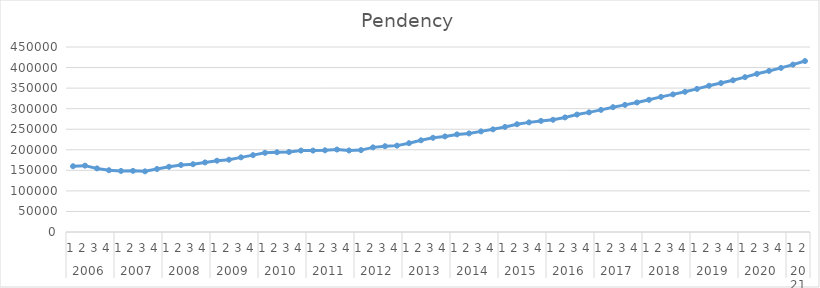
| Category | Pendency |
|---|---|
| 0 | 159976 |
| 1 | 161396 |
| 2 | 154692 |
| 3 | 150263 |
| 4 | 148512 |
| 5 | 148712 |
| 6 | 147537 |
| 7 | 153247 |
| 8 | 158692 |
| 9 | 163002 |
| 10 | 164863 |
| 11 | 169214 |
| 12 | 173454 |
| 13 | 175846 |
| 14 | 181585 |
| 15 | 187050 |
| 16 | 192574 |
| 17 | 194000 |
| 18 | 194691 |
| 19 | 198084 |
| 20 | 198027 |
| 21 | 198757 |
| 22 | 200634 |
| 23 | 198214 |
| 24 | 199229 |
| 25 | 205868 |
| 26 | 208700 |
| 27 | 210101 |
| 28 | 216068 |
| 29 | 223067 |
| 30 | 229176 |
| 31 | 232459 |
| 32 | 237413 |
| 33 | 239745 |
| 34 | 244762 |
| 35 | 249701 |
| 36 | 255525 |
| 37 | 262148 |
| 38 | 266681 |
| 39 | 270272 |
| 40 | 272971 |
| 41 | 278695 |
| 42 | 285663 |
| 43 | 290963.467 |
| 44 | 297009.83 |
| 45 | 303629.194 |
| 46 | 309175.921 |
| 47 | 314980.418 |
| 48 | 321530.812 |
| 49 | 328654.206 |
| 50 | 334704.964 |
| 51 | 341013.491 |
| 52 | 348067.915 |
| 53 | 355695.339 |
| 54 | 362250.127 |
| 55 | 369062.685 |
| 56 | 376621.139 |
| 57 | 384752.594 |
| 58 | 391811.412 |
| 59 | 399128 |
| 60 | 407190.485 |
| 61 | 415825.97 |